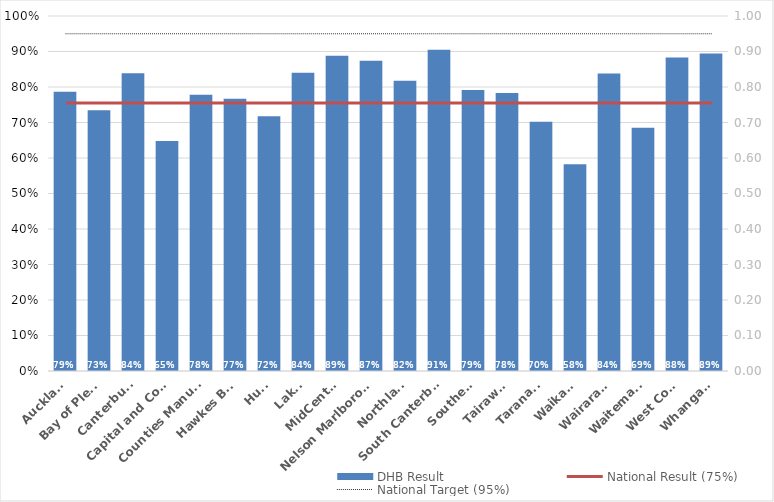
| Category | DHB Result |
|---|---|
| Auckland | 0.787 |
| Bay of Plenty | 0.735 |
| Canterbury | 0.839 |
| Capital and Coast | 0.648 |
| Counties Manukau | 0.778 |
| Hawkes Bay | 0.767 |
| Hutt | 0.718 |
| Lakes | 0.84 |
| MidCentral | 0.888 |
| Nelson Marlborough | 0.874 |
| Northland | 0.818 |
| South Canterbury | 0.905 |
| Southern | 0.792 |
| Tairawhiti | 0.783 |
| Taranaki | 0.702 |
| Waikato | 0.582 |
| Wairarapa | 0.838 |
| Waitemata | 0.685 |
| West Coast | 0.883 |
| Whanganui | 0.894 |